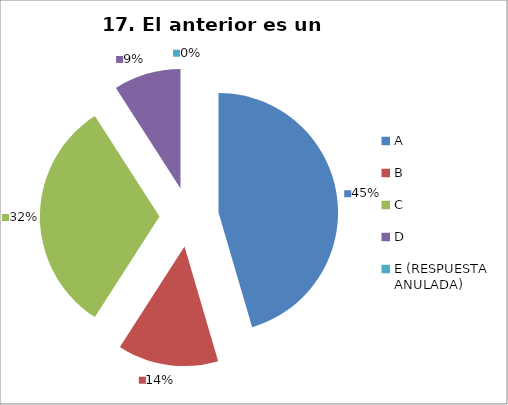
| Category | CANTIDAD DE RESPUESTAS PREGUNTA (17) | PORCENTAJE |
|---|---|---|
| A | 10 | 0.455 |
| B | 3 | 0.136 |
| C | 7 | 0.318 |
| D | 2 | 0.091 |
| E (RESPUESTA ANULADA) | 0 | 0 |